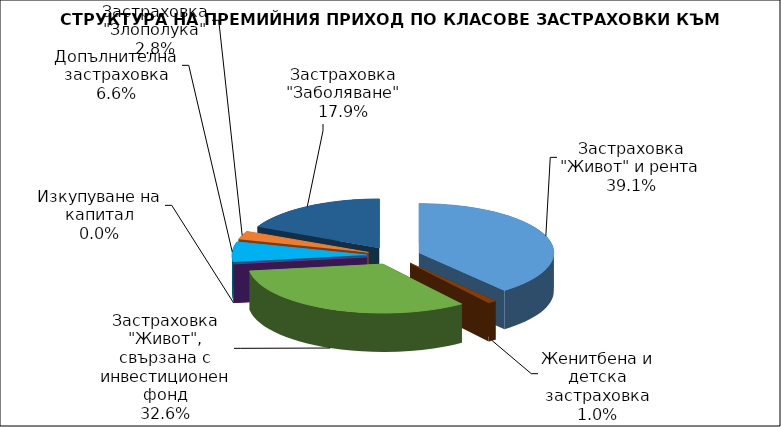
| Category | Застраховка "Живот" и рента |
|---|---|
| Застраховка "Живот" и рента | 209165544.163 |
| Женитбена и детска застраховка | 5518050.685 |
| Застраховка "Живот", свързана с инвестиционен фонд | 174800685.496 |
| Изкупуване на капитал | 0 |
| Допълнителна застраховка | 35302371.418 |
| Застраховка "Злополука" | 14764032.99 |
| Застраховка "Заболяване" | 96012989.58 |